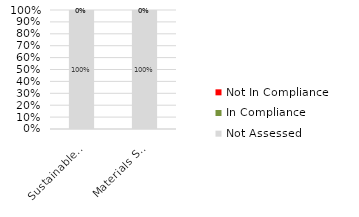
| Category | Not Assessed | In Compliance | Not In Compliance |
|---|---|---|---|
| Sustainable Sites | 1 | 0 | 0 |
| Materials Selection | 1 | 0 | 0 |